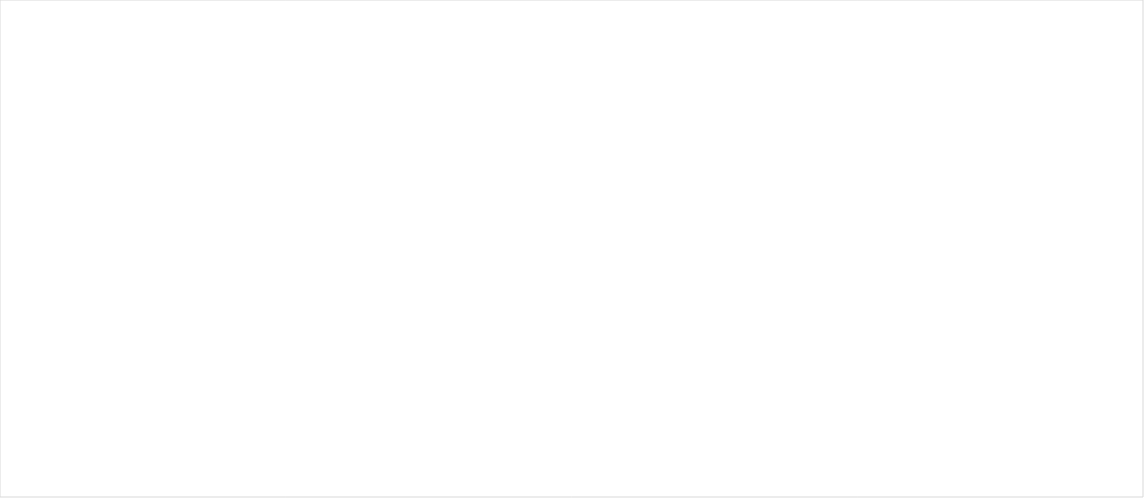
| Category | Gjennomsnitt av L1 | Gjennomsnitt av L2 | Gjennomsnitt av L3 | Gjennomsnitt av L4 | Gjennomsnitt av L5 | Gjennomsnitt av L6 | Gjennomsnitt av S1 | Gjennomsnitt av S2 |
|---|---|---|---|---|---|---|---|---|
| Totalt | 1.103 | 1.034 | 1 | 1.345 | 1.276 | 0.966 | 2.724 | 2.724 |